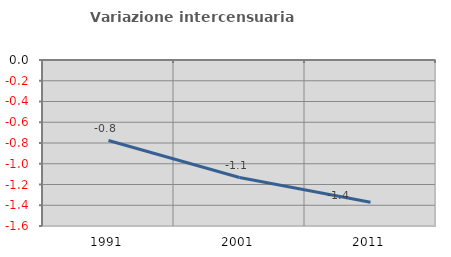
| Category | Variazione intercensuaria annua |
|---|---|
| 1991.0 | -0.776 |
| 2001.0 | -1.133 |
| 2011.0 | -1.372 |